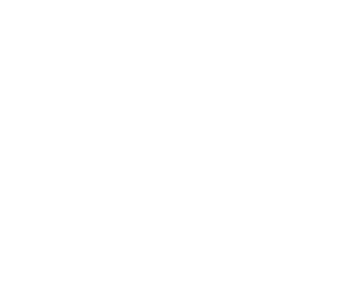
| Category | Series 0 |
|---|---|
| INCOME | 0 |
| SAVINGS  | 0 |
| EXPENSES | 0 |